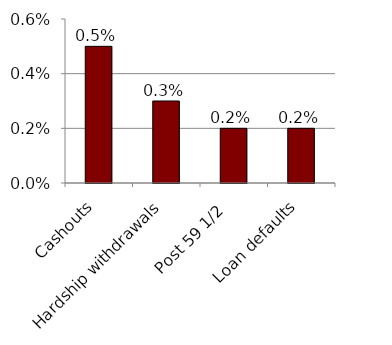
| Category | Series 0 |
|---|---|
| Cashouts | 0.005 |
| Hardship withdrawals | 0.003 |
| Post 59 1/2  | 0.002 |
| Loan defaults | 0.002 |